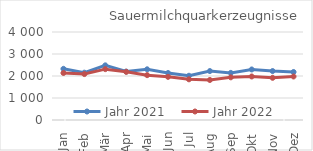
| Category | Jahr 2021 | Jahr 2022 |
|---|---|---|
| Jan | 2326.495 | 2136.826 |
| Feb | 2150.691 | 2087.892 |
| Mär | 2484.103 | 2311.452 |
| Apr | 2202.362 | 2190.079 |
| Mai | 2303.964 | 2038.48 |
| Jun | 2134.711 | 1961.476 |
| Jul | 2010.937 | 1849.252 |
| Aug | 2223.981 | 1819.046 |
| Sep | 2141.438 | 1940.02 |
| Okt | 2297.181 | 1978.673 |
| Nov | 2224.804 | 1917.817 |
| Dez | 2181.983 | 1977.656 |